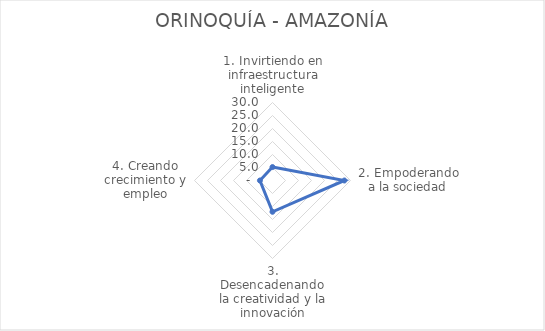
| Category | ORINOQUÍA - AMAZONÍA |
|---|---|
| 1. Invirtiendo en infraestructura inteligente | 5.169 |
| 2. Empoderando a la sociedad | 27.658 |
| 3. Desencadenando la creatividad y la innovación | 12.031 |
| 4. Creando crecimiento y empleo | 4.832 |